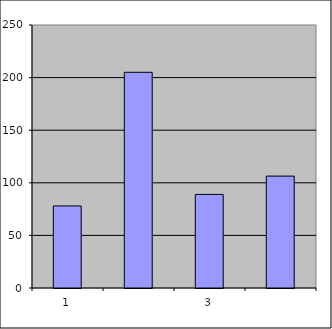
| Category | Series 0 |
|---|---|
| 0 | 78 |
| 1 | 205.032 |
| 2 | 88.962 |
| 3 | 106.363 |